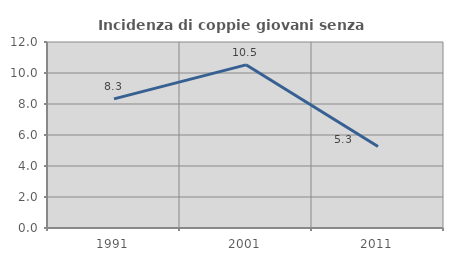
| Category | Incidenza di coppie giovani senza figli |
|---|---|
| 1991.0 | 8.333 |
| 2001.0 | 10.526 |
| 2011.0 | 5.263 |